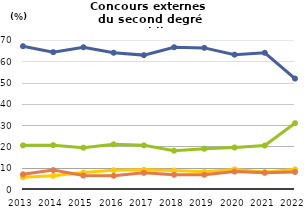
| Category | Étudiants | Enseignants et personnels d'éducation et de surveillance                            | Autres emplois dans secteurs public ou privé                | Sans emploi                    |
|---|---|---|---|---|
| 2013.0 | 67.1 | 20.5 | 5.5 | 6.9 |
| 2014.0 | 64.3 | 20.6 | 6.2 | 8.9 |
| 2015.0 | 66.6 | 19.4 | 7.7 | 6.3 |
| 2016.0 | 64 | 21 | 8.8 | 6.2 |
| 2017.0 | 62.9 | 20.5 | 9 | 7.6 |
| 2018.0 | 66.6 | 18 | 8.7 | 6.7 |
| 2019.0 | 66.3 | 18.9 | 8.1 | 6.7 |
| 2020.0 | 63.1 | 19.5 | 9.2 | 8.2 |
| 2021.0 | 64 | 20.4 | 8 | 7.6 |
| 2022.0 | 51.9 | 30.9 | 9.2 | 8 |